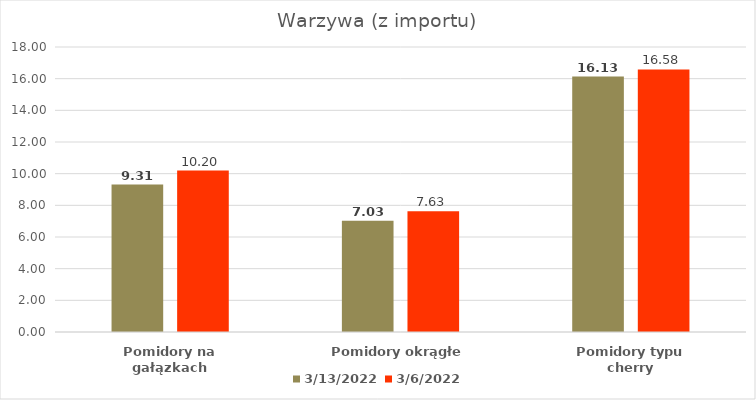
| Category | 13.03.2022 | 06.03.2022 |
|---|---|---|
| Pomidory na gałązkach | 9.31 | 10.2 |
| Pomidory okrągłe | 7.03 | 7.63 |
| Pomidory typu cherry | 16.13 | 16.58 |